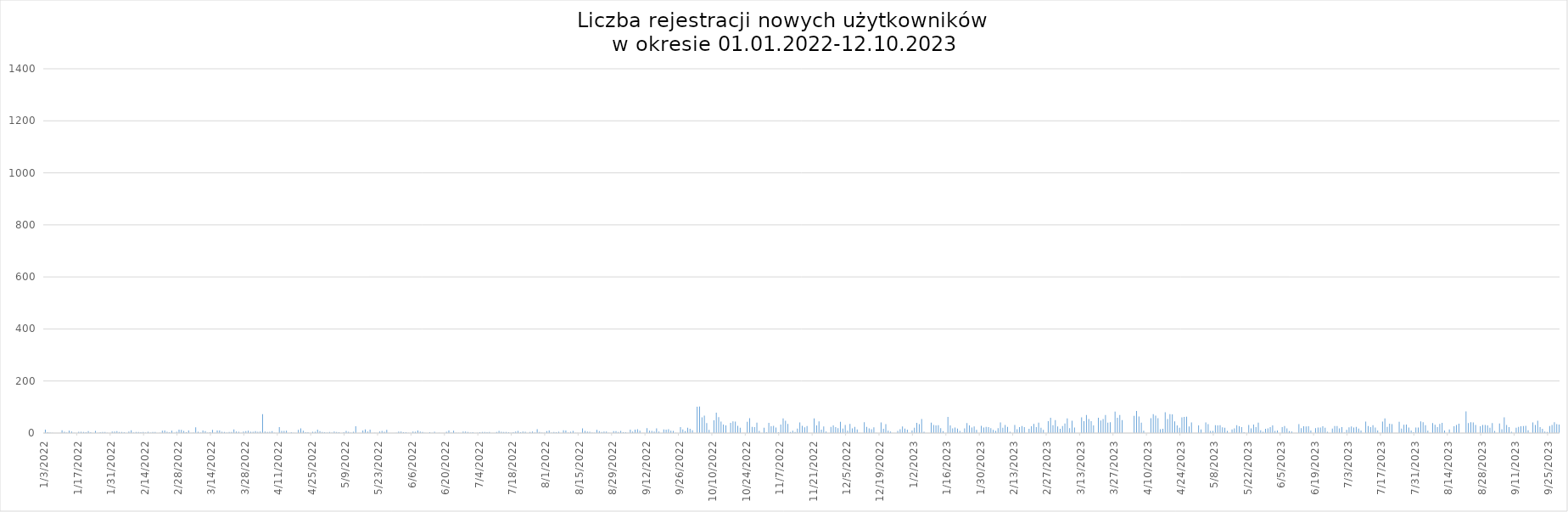
| Category | Dzienna liczba rejestracji |
|---|---|
| 1/3/22 | 13 |
| 1/4/22 | 3 |
| 1/5/22 | 2 |
| 1/6/22 | 1 |
| 1/10/22 | 11 |
| 1/11/22 | 5 |
| 1/12/22 | 2 |
| 1/13/22 | 9 |
| 1/14/22 | 6 |
| 1/15/22 | 1 |
| 1/17/22 | 5 |
| 1/18/22 | 5 |
| 1/19/22 | 4 |
| 1/20/22 | 3 |
| 1/21/22 | 7 |
| 1/22/22 | 3 |
| 1/24/22 | 8 |
| 1/25/22 | 1 |
| 1/26/22 | 3 |
| 1/27/22 | 4 |
| 1/28/22 | 4 |
| 1/29/22 | 1 |
| 1/31/22 | 6 |
| nan | 107 |
| 2/1/22 | 6 |
| 2/2/22 | 7 |
| 2/3/22 | 4 |
| 2/4/22 | 4 |
| 2/5/22 | 3 |
| 2/7/22 | 6 |
| 2/8/22 | 11 |
| 2/9/22 | 2 |
| 2/10/22 | 4 |
| 2/11/22 | 4 |
| 2/12/22 | 3 |
| 2/13/22 | 4 |
| 2/14/22 | 2 |
| 2/15/22 | 5 |
| 2/16/22 | 2 |
| 2/17/22 | 4 |
| 2/18/22 | 4 |
| 2/20/22 | 1 |
| 2/21/22 | 9 |
| 2/22/22 | 10 |
| 2/23/22 | 5 |
| 2/24/22 | 3 |
| 2/25/22 | 9 |
| 2/26/22 | 1 |
| 2/27/22 | 5 |
| 2/28/22 | 13 |
| nan | 131 |
| 3/1/22 | 12 |
| 3/2/22 | 8 |
| 3/3/22 | 3 |
| 3/4/22 | 10 |
| 3/5/22 | 1 |
| 3/6/22 | 2 |
| 3/7/22 | 22 |
| 3/8/22 | 5 |
| 3/9/22 | 2 |
| 3/10/22 | 10 |
| 3/11/22 | 7 |
| 3/12/22 | 2 |
| 3/13/22 | 3 |
| 3/14/22 | 12 |
| 3/15/22 | 1 |
| 3/16/22 | 10 |
| 3/17/22 | 10 |
| 3/18/22 | 5 |
| 3/19/22 | 4 |
| 3/20/22 | 2 |
| 3/21/22 | 4 |
| 3/22/22 | 4 |
| 3/23/22 | 14 |
| 3/24/22 | 6 |
| 3/25/22 | 5 |
| 3/26/22 | 1 |
| 3/27/22 | 6 |
| 3/28/22 | 7 |
| 3/29/22 | 9 |
| 3/30/22 | 5 |
| 3/31/22 | 5 |
| nan | 197 |
| 4/1/22 | 7 |
| 4/2/22 | 5 |
| 4/3/22 | 6 |
| 4/4/22 | 73 |
| 4/5/22 | 6 |
| 4/6/22 | 4 |
| 4/7/22 | 5 |
| 4/8/22 | 7 |
| 4/9/22 | 1 |
| 4/11/22 | 23 |
| 4/12/22 | 8 |
| 4/13/22 | 8 |
| 4/14/22 | 9 |
| 4/16/22 | 3 |
| 4/17/22 | 1 |
| 4/19/22 | 12 |
| 4/20/22 | 18 |
| 4/21/22 | 9 |
| 4/22/22 | 3 |
| 4/23/22 | 3 |
| 4/25/22 | 5 |
| 4/26/22 | 5 |
| 4/27/22 | 13 |
| 4/28/22 | 7 |
| 4/29/22 | 4 |
| 4/30/22 | 3 |
| nan | 248 |
| 5/1/22 | 2 |
| 5/2/22 | 4 |
| 5/3/22 | 2 |
| 5/4/22 | 6 |
| 5/5/22 | 4 |
| 5/6/22 | 3 |
| 5/8/22 | 3 |
| 5/9/22 | 8 |
| 5/10/22 | 5 |
| 5/11/22 | 2 |
| 5/12/22 | 5 |
| 5/13/22 | 26 |
| 5/16/22 | 10 |
| 5/17/22 | 14 |
| 5/18/22 | 6 |
| 5/19/22 | 13 |
| 5/21/22 | 1 |
| 5/23/22 | 6 |
| 5/24/22 | 8 |
| 5/25/22 | 5 |
| 5/26/22 | 12 |
| 5/30/22 | 1 |
| 5/31/22 | 6 |
| nan | 152 |
| 6/1/22 | 6 |
| 6/2/22 | 3 |
| 6/3/22 | 3 |
| 6/4/22 | 1 |
| 6/6/22 | 6 |
| 6/7/22 | 5 |
| 6/8/22 | 10 |
| 6/9/22 | 6 |
| 6/10/22 | 4 |
| 6/11/22 | 1 |
| 6/13/22 | 3 |
| 6/14/22 | 1 |
| 6/15/22 | 5 |
| 6/17/22 | 1 |
| 6/20/22 | 5 |
| 6/21/22 | 10 |
| 6/22/22 | 2 |
| 6/23/22 | 9 |
| 6/24/22 | 1 |
| 6/25/22 | 1 |
| 6/27/22 | 6 |
| 6/28/22 | 6 |
| 6/29/22 | 4 |
| 6/30/22 | 2 |
| nan | 101 |
| 7/1/22 | 3 |
| 7/3/22 | 1 |
| 7/4/22 | 3 |
| 7/5/22 | 4 |
| 7/6/22 | 4 |
| 7/7/22 | 3 |
| 7/8/22 | 4 |
| 7/11/22 | 4 |
| 7/12/22 | 8 |
| 7/13/22 | 5 |
| 7/14/22 | 4 |
| 7/15/22 | 4 |
| 7/16/22 | 3 |
| 7/17/22 | 1 |
| 7/18/22 | 3 |
| 7/19/22 | 6 |
| 7/20/22 | 8 |
| 7/21/22 | 3 |
| 7/22/22 | 6 |
| 7/23/22 | 5 |
| 7/25/22 | 4 |
| 7/26/22 | 6 |
| 7/27/22 | 2 |
| 7/28/22 | 15 |
| 7/29/22 | 4 |
| 7/30/22 | 2 |
| 7/31/22 | 1 |
| nan | 116 |
| 8/1/22 | 7 |
| 8/2/22 | 10 |
| 8/3/22 | 2 |
| 8/4/22 | 4 |
| 8/5/22 | 3 |
| 8/6/22 | 5 |
| 8/8/22 | 11 |
| 8/9/22 | 10 |
| 8/10/22 | 2 |
| 8/11/22 | 5 |
| 8/12/22 | 8 |
| 8/13/22 | 1 |
| 8/14/22 | 1 |
| 8/16/22 | 18 |
| 8/17/22 | 8 |
| 8/18/22 | 6 |
| 8/19/22 | 5 |
| 8/20/22 | 2 |
| 8/21/22 | 1 |
| 8/22/22 | 12 |
| 8/23/22 | 7 |
| 8/24/22 | 4 |
| 8/25/22 | 6 |
| 8/26/22 | 6 |
| 8/27/22 | 1 |
| 8/29/22 | 7 |
| 8/30/22 | 7 |
| 8/31/22 | 4 |
| nan | 163 |
| 9/1/22 | 8 |
| 9/2/22 | 3 |
| 9/3/22 | 3 |
| 9/4/22 | 1 |
| 9/5/22 | 13 |
| 9/6/22 | 6 |
| 9/7/22 | 13 |
| 9/8/22 | 15 |
| 9/9/22 | 9 |
| 9/12/22 | 19 |
| 9/13/22 | 9 |
| 9/14/22 | 8 |
| 9/15/22 | 6 |
| 9/16/22 | 18 |
| 9/17/22 | 6 |
| 9/19/22 | 14 |
| 9/20/22 | 13 |
| 9/21/22 | 15 |
| 9/22/22 | 9 |
| 9/23/22 | 8 |
| 9/24/22 | 1 |
| 9/26/22 | 23 |
| 9/27/22 | 14 |
| 9/28/22 | 7 |
| 9/29/22 | 20 |
| 9/30/22 | 16 |
| nan | 277 |
| 10/1/22 | 11 |
| 10/3/22 | 101 |
| 10/4/22 | 102 |
| 10/5/22 | 60 |
| 10/6/22 | 67 |
| 10/7/22 | 38 |
| 10/8/22 | 12 |
| 10/10/22 | 49 |
| 10/11/22 | 78 |
| 10/12/22 | 61 |
| 10/13/22 | 44 |
| 10/14/22 | 33 |
| 10/15/22 | 29 |
| 10/17/22 | 39 |
| 10/18/22 | 45 |
| 10/19/22 | 44 |
| 10/20/22 | 28 |
| 10/21/22 | 20 |
| 10/24/22 | 43 |
| 10/25/22 | 57 |
| 10/26/22 | 24 |
| 10/27/22 | 23 |
| 10/28/22 | 40 |
| 10/29/22 | 8 |
| 10/31/22 | 20 |
| nan | 1076 |
| 11/1/22 | 3 |
| 11/2/22 | 39 |
| 11/3/22 | 26 |
| 11/4/22 | 28 |
| 11/5/22 | 21 |
| 11/6/22 | 3 |
| 11/7/22 | 33 |
| 11/8/22 | 56 |
| 11/9/22 | 47 |
| 11/10/22 | 35 |
| 11/11/22 | 4 |
| 11/12/22 | 9 |
| 11/13/22 | 4 |
| 11/14/22 | 17 |
| 11/15/22 | 41 |
| 11/16/22 | 28 |
| 11/17/22 | 22 |
| 11/18/22 | 27 |
| 11/21/22 | 56 |
| 11/22/22 | 29 |
| 11/23/22 | 45 |
| 11/24/22 | 13 |
| 11/25/22 | 25 |
| 11/26/22 | 6 |
| 11/28/22 | 24 |
| 11/29/22 | 29 |
| 11/30/22 | 23 |
| nan | 693 |
| 12/1/22 | 19 |
| 12/2/22 | 43 |
| 12/3/22 | 17 |
| 12/4/22 | 31 |
| 12/5/22 | 9 |
| 12/6/22 | 35 |
| 12/7/22 | 18 |
| 12/8/22 | 24 |
| 12/9/22 | 14 |
| 12/10/22 | 1 |
| 12/12/22 | 42 |
| 12/13/22 | 24 |
| 12/14/22 | 18 |
| 12/15/22 | 15 |
| 12/16/22 | 22 |
| 12/17/22 | 1 |
| 12/19/22 | 41 |
| 12/20/22 | 16 |
| 12/21/22 | 34 |
| 12/22/22 | 9 |
| 12/23/22 | 6 |
| 12/26/22 | 8 |
| 12/27/22 | 15 |
| 12/28/22 | 25 |
| 12/29/22 | 17 |
| 12/30/22 | 13 |
| nan | 517 |
| 1/1/23 | 10 |
| 1/2/23 | 20 |
| 1/3/23 | 39 |
| 1/4/23 | 34 |
| 1/5/23 | 54 |
| 1/6/23 | 5 |
| 1/9/23 | 40 |
| 1/10/23 | 31 |
| 1/11/23 | 29 |
| 1/12/23 | 30 |
| 1/13/23 | 19 |
| 1/14/23 | 7 |
| 1/16/23 | 62 |
| 1/17/23 | 29 |
| 1/18/23 | 18 |
| 1/19/23 | 21 |
| 1/20/23 | 17 |
| 1/21/23 | 8 |
| 1/22/23 | 2 |
| 1/23/23 | 18 |
| 1/24/23 | 38 |
| 1/25/23 | 29 |
| 1/26/23 | 21 |
| 1/27/23 | 25 |
| 1/28/23 | 12 |
| 1/30/23 | 28 |
| 1/31/23 | 21 |
| nan | 667 |
| 2/1/23 | 24 |
| 2/2/23 | 23 |
| 2/3/23 | 19 |
| 2/4/23 | 12 |
| 2/5/23 | 8 |
| 2/6/23 | 19 |
| 2/7/23 | 41 |
| 2/8/23 | 20 |
| 2/9/23 | 31 |
| 2/10/23 | 24 |
| 2/11/23 | 5 |
| 2/13/23 | 31 |
| 2/14/23 | 15 |
| 2/15/23 | 23 |
| 2/16/23 | 27 |
| 2/17/23 | 23 |
| 2/19/23 | 16 |
| 2/20/23 | 26 |
| 2/21/23 | 35 |
| 2/22/23 | 23 |
| 2/23/23 | 40 |
| 2/24/23 | 20 |
| 2/25/23 | 12 |
| 2/27/23 | 46 |
| 2/28/23 | 59 |
| nan | 622 |
| 3/1/23 | 30 |
| 3/2/23 | 50 |
| 3/3/23 | 25 |
| 3/4/23 | 16 |
| 3/5/23 | 27 |
| 3/6/23 | 37 |
| 3/7/23 | 56 |
| 3/8/23 | 19 |
| 3/9/23 | 47 |
| 3/10/23 | 21 |
| 3/13/23 | 60 |
| 3/14/23 | 46 |
| 3/15/23 | 69 |
| 3/16/23 | 54 |
| 3/17/23 | 46 |
| 3/18/23 | 29 |
| 3/20/23 | 59 |
| 3/21/23 | 48 |
| 3/22/23 | 54 |
| 3/23/23 | 69 |
| 3/24/23 | 40 |
| 3/25/23 | 42 |
| 3/27/23 | 82 |
| 3/28/23 | 59 |
| 3/29/23 | 69 |
| 3/30/23 | 50 |
| nan | 1204 |
| 4/4/23 | 66 |
| 4/5/23 | 85 |
| 4/6/23 | 64 |
| 4/7/23 | 40 |
| 4/8/23 | 9 |
| 4/11/23 | 57 |
| 4/12/23 | 73 |
| 4/13/23 | 67 |
| 4/14/23 | 57 |
| 4/15/23 | 15 |
| 4/16/23 | 16 |
| 4/17/23 | 80 |
| 4/18/23 | 54 |
| 4/19/23 | 73 |
| 4/20/23 | 72 |
| 4/21/23 | 45 |
| 4/22/23 | 29 |
| 4/23/23 | 20 |
| 4/24/23 | 60 |
| 4/25/23 | 62 |
| 4/26/23 | 63 |
| 4/27/23 | 25 |
| 4/28/23 | 41 |
| 4/29/23 | 0 |
| 4/30/23 | 0 |
| nan | 1173 |
| 5/1/23 | 29 |
| 5/2/23 | 14 |
| 5/4/23 | 41 |
| 5/5/23 | 34 |
| 5/6/23 | 8 |
| 5/7/23 | 8 |
| 5/8/23 | 30 |
| 5/9/23 | 29 |
| 5/10/23 | 30 |
| 5/11/23 | 22 |
| 5/12/23 | 20 |
| 5/13/23 | 8 |
| 5/15/23 | 14 |
| 5/16/23 | 18 |
| 5/17/23 | 30 |
| 5/18/23 | 26 |
| 5/19/23 | 23 |
| 5/20/23 | 3 |
| 5/22/23 | 31 |
| 5/23/23 | 18 |
| 5/24/23 | 33 |
| 5/25/23 | 23 |
| 5/26/23 | 40 |
| 5/27/23 | 11 |
| 5/28/23 | 5 |
| 5/29/23 | 16 |
| 5/30/23 | 18 |
| 5/31/23 | 23 |
| nan | 605 |
| 6/1/23 | 29 |
| 6/2/23 | 8 |
| 6/3/23 | 10 |
| 6/5/23 | 23 |
| 6/6/23 | 27 |
| 6/7/23 | 18 |
| 6/8/23 | 7 |
| 6/9/23 | 6 |
| 6/12/23 | 34 |
| 6/13/23 | 19 |
| 6/14/23 | 26 |
| 6/15/23 | 25 |
| 6/16/23 | 26 |
| 6/17/23 | 10 |
| 6/19/23 | 19 |
| 6/20/23 | 21 |
| 6/21/23 | 21 |
| 6/22/23 | 26 |
| 6/23/23 | 20 |
| 6/24/23 | 5 |
| 6/26/23 | 17 |
| 6/27/23 | 27 |
| 6/28/23 | 27 |
| 6/29/23 | 18 |
| 6/30/23 | 23 |
| nan | 492 |
| 7/1/23 | 2 |
| 7/2/23 | 12 |
| 7/3/23 | 22 |
| 7/4/23 | 25 |
| 7/5/23 | 21 |
| 7/6/23 | 24 |
| 7/7/23 | 17 |
| 7/8/23 | 10 |
| 7/10/23 | 44 |
| 7/11/23 | 27 |
| 7/12/23 | 23 |
| 7/13/23 | 30 |
| 7/14/23 | 21 |
| 7/15/23 | 10 |
| 7/17/23 | 44 |
| 7/18/23 | 56 |
| 7/19/23 | 24 |
| 7/20/23 | 36 |
| 7/21/23 | 34 |
| 7/24/23 | 43 |
| 7/25/23 | 17 |
| 7/26/23 | 32 |
| 7/27/23 | 33 |
| 7/28/23 | 21 |
| 7/29/23 | 10 |
| 7/30/23 | 3 |
| 7/31/23 | 21 |
| nan | 662 |
| 8/1/23 | 21 |
| 8/2/23 | 45 |
| 8/3/23 | 42 |
| 8/4/23 | 30 |
| 8/5/23 | 9 |
| 8/7/23 | 38 |
| 8/8/23 | 32 |
| 8/9/23 | 23 |
| 8/10/23 | 35 |
| 8/11/23 | 39 |
| 8/12/23 | 10 |
| 8/14/23 | 14 |
| 8/16/23 | 26 |
| 8/17/23 | 31 |
| 8/18/23 | 36 |
| 8/21/23 | 83 |
| 8/22/23 | 38 |
| 8/23/23 | 42 |
| 8/24/23 | 41 |
| 8/25/23 | 31 |
| 8/27/23 | 26 |
| 8/28/23 | 31 |
| 8/29/23 | 31 |
| 8/30/23 | 29 |
| 8/31/23 | 20 |
| nan | 803 |
| 9/1/23 | 38 |
| 9/2/23 | 8 |
| 9/4/23 | 37 |
| 9/5/23 | 15 |
| 9/6/23 | 60 |
| 9/7/23 | 31 |
| 9/8/23 | 23 |
| 9/9/23 | 5 |
| 9/11/23 | 20 |
| 9/12/23 | 24 |
| 9/13/23 | 26 |
| 9/14/23 | 27 |
| 9/15/23 | 28 |
| 9/16/23 | 11 |
| 9/18/23 | 41 |
| 9/19/23 | 31 |
| 9/20/23 | 47 |
| 9/21/23 | 23 |
| 9/22/23 | 16 |
| 9/23/23 | 6 |
| 9/24/23 | 4 |
| 9/25/23 | 27 |
| 9/26/23 | 31 |
| 9/27/23 | 42 |
| 9/28/23 | 34 |
| 9/29/23 | 33 |
| nan | 688 |